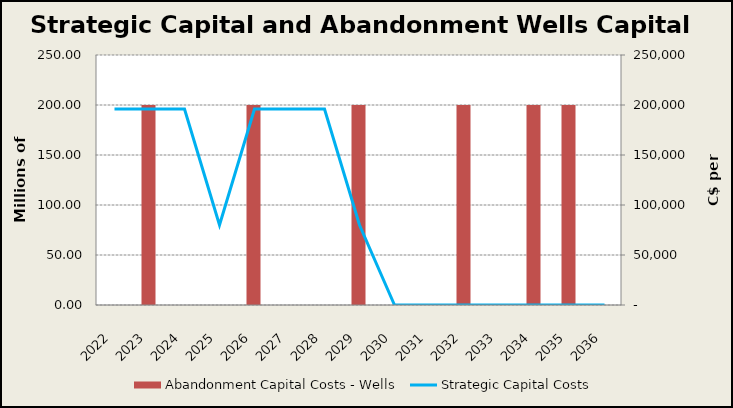
| Category | Abandonment Capital Costs - Wells |
|---|---|
| 2022.0 | 0 |
| 2023.0 | 200000 |
| 2024.0 | 0 |
| 2025.0 | 0 |
| 2026.0 | 200000 |
| 2027.0 | 0 |
| 2028.0 | 0 |
| 2029.0 | 200000 |
| 2030.0 | 0 |
| 2031.0 | 0 |
| 2032.0 | 200000 |
| 2033.0 | 0 |
| 2034.0 | 200000 |
| 2035.0 | 200000 |
| 2036.0 | 0 |